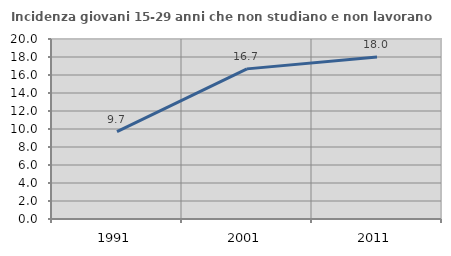
| Category | Incidenza giovani 15-29 anni che non studiano e non lavorano  |
|---|---|
| 1991.0 | 9.704 |
| 2001.0 | 16.68 |
| 2011.0 | 18 |